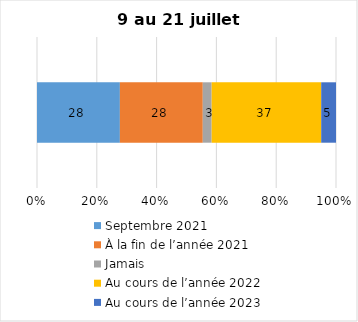
| Category | Septembre 2021 | À la fin de l’année 2021 | Jamais | Au cours de l’année 2022 | Au cours de l’année 2023 |
|---|---|---|---|---|---|
| 0 | 28 | 28 | 3 | 37 | 5 |